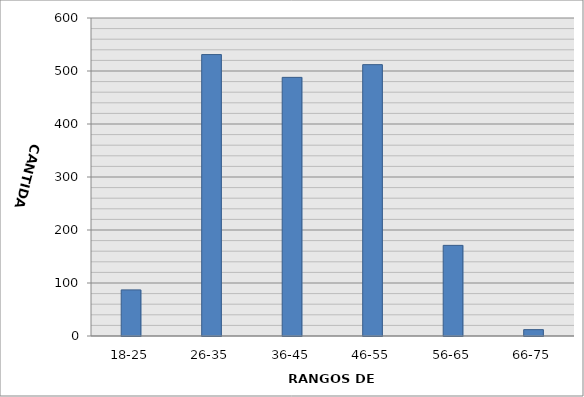
| Category | Series 0 |
|---|---|
| 18-25 | 87 |
| 26-35 | 531 |
| 36-45 | 488 |
| 46-55 | 512 |
| 56-65 | 171 |
| 66-75 | 12 |